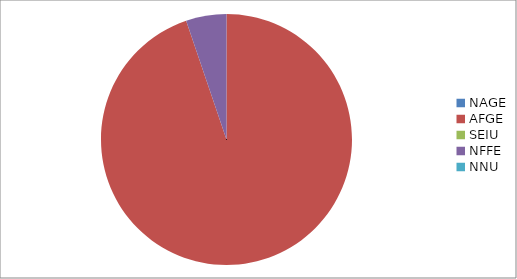
| Category | Series 0 |
|---|---|
| NAGE | 0 |
| AFGE | 10352 |
| SEIU | 0 |
| NFFE | 569 |
| NNU | 0 |